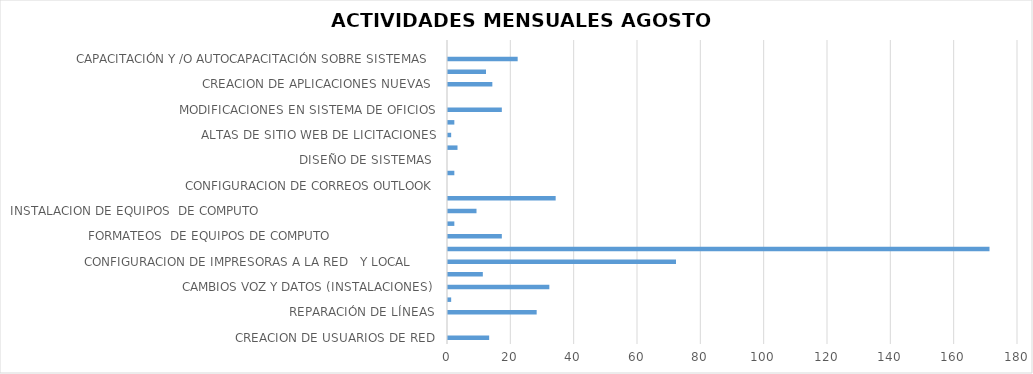
| Category | Series 0 |
|---|---|
| CREACION DE USUARIOS DE RED | 13 |
| CREACION DE CLAVES PARA LLAMADAS A CELULAR  | 0 |
| REPARACIÓN DE LÍNEAS | 28 |
| DICTAMENES DE EQUIPOS (TELEFONOS Y FAXES) | 1 |
| CAMBIOS VOZ Y DATOS (INSTALACIONES) | 32 |
| DICTAMENES DE EQUIPOS DE COMPUTO                             | 11 |
| CONFIGURACION DE IMPRESORAS A LA RED   Y LOCAL       | 72 |
| REVISION DE EQUIPOS DE COMPUTO             | 171 |
| FORMATEOS  DE EQUIPOS DE COMPUTO                            | 17 |
| MANTENIMIENTO DE EQUIPOS  DE COMPUTO               | 2 |
| INSTALACION DE EQUIPOS  DE COMPUTO                                               | 9 |
| INSTALACION DE SOFTWARE EN EQUIPOS DE COMPUTO | 34 |
| CONFIGURACION DE CORREOS OUTLOOK | 0 |
| REPARACIÓN DE EQUIPOS DE CÓMPUTO | 2 |
| DISEÑO DE SISTEMAS  | 0 |
| CREACIÓN DE USUARIOS DE OFICIOS Y CORREOS ELECTRONICOS | 3 |
| ALTAS DE SITIO WEB DE LICITACIONES | 1 |
| SISTEMA EN DESARROLLO | 2 |
| MODIFICACIONES EN SISTEMA DE OFICIOS | 17 |
| MODIFICACION EN SITIO WEB | 0 |
| CREACION DE APLICACIONES NUEVAS  | 14 |
| MANTENIMIENTO DE SISTEMAS  | 12 |
| CAPACITACIÓN Y /O AUTOCAPACITACIÓN SOBRE SISTEMAS  | 22 |
| RESPALDO DE INFORMACIÓN DE BASE DE DATOS  | 0 |